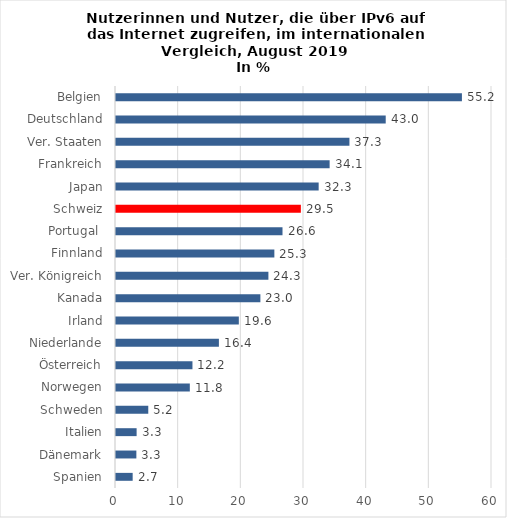
| Category | Series 0 |
|---|---|
| Spanien | 2.66 |
| Dänemark | 3.25 |
| Italien | 3.29 |
| Schweden | 5.15 |
| Norwegen | 11.78 |
| Österreich | 12.2 |
| Niederlande | 16.42 |
| Irland | 19.6 |
| Kanada | 23.04 |
| Ver. Königreich | 24.32 |
| Finnland | 25.27 |
| Portugal  | 26.57 |
| Schweiz | 29.5 |
| Japan | 32.34 |
| Frankreich | 34.09 |
| Ver. Staaten | 37.25 |
| Deutschland | 43.04 |
| Belgien | 55.2 |